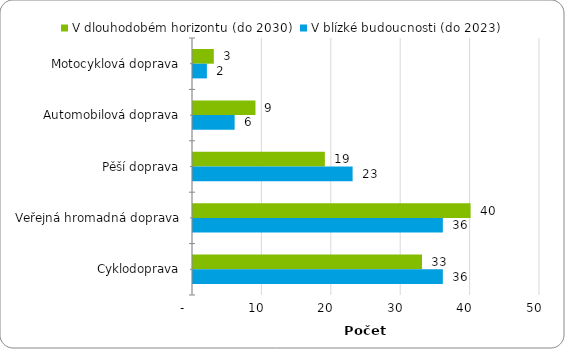
| Category | V dlouhodobém horizontu (do 2030) | V blízké budoucnosti (do 2023) |
|---|---|---|
|  Motocyklová doprava | 3 | 2 |
|  Automobilová doprava | 9 | 6 |
|  Pěší doprava | 19 | 23 |
|  Veřejná hromadná doprava | 40 | 36 |
|  Cyklodoprava | 33 | 36 |